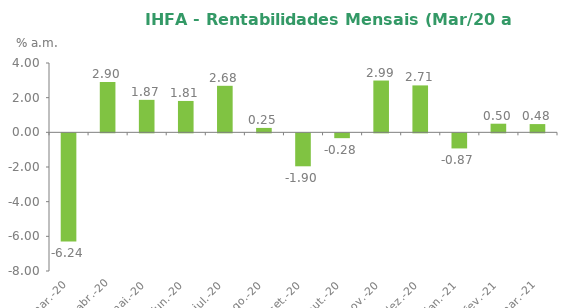
| Category | Series 0 |
|---|---|
| 2020-03-31 | -6.239 |
| 2020-04-30 | 2.899 |
| 2020-05-31 | 1.874 |
| 2020-06-30 | 1.811 |
| 2020-07-31 | 2.684 |
| 2020-08-31 | 0.254 |
| 2020-09-30 | -1.901 |
| 2020-10-31 | -0.278 |
| 2020-11-30 | 2.988 |
| 2020-12-31 | 2.707 |
| 2021-01-31 | -0.871 |
| 2021-02-28 | 0.498 |
| 2021-03-31 | 0.476 |